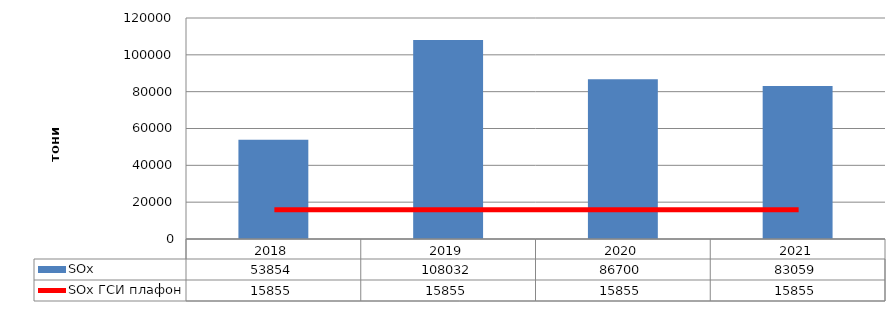
| Category | SOx |
|---|---|
| 2018.0 | 53854 |
| 2019.0 | 108032 |
| 2020.0 | 86700 |
| 2021.0 | 83059 |